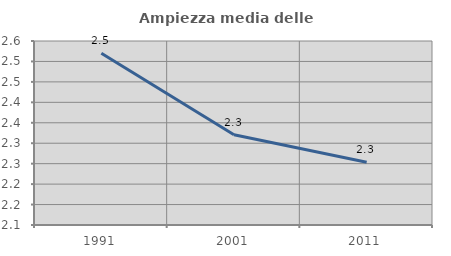
| Category | Ampiezza media delle famiglie |
|---|---|
| 1991.0 | 2.52 |
| 2001.0 | 2.321 |
| 2011.0 | 2.254 |